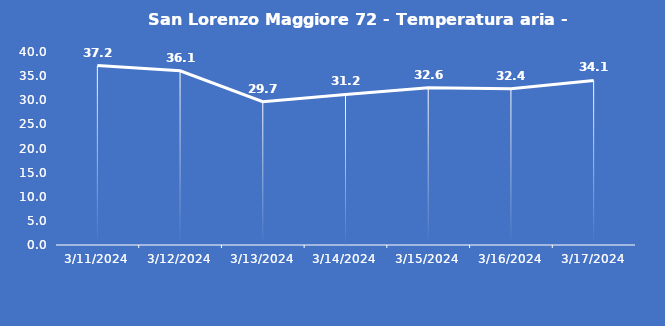
| Category | San Lorenzo Maggiore 72 - Temperatura aria - Grezzo (°C) |
|---|---|
| 3/11/24 | 37.2 |
| 3/12/24 | 36.1 |
| 3/13/24 | 29.7 |
| 3/14/24 | 31.2 |
| 3/15/24 | 32.6 |
| 3/16/24 | 32.4 |
| 3/17/24 | 34.1 |